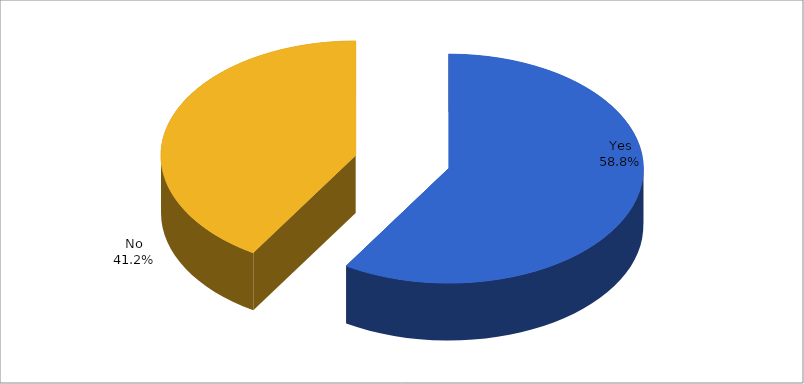
| Category | Series 0 |
|---|---|
| Yes | 0.588 |
| No | 0.412 |